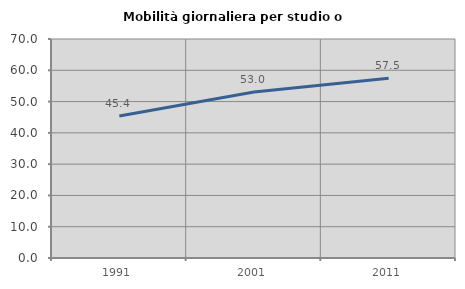
| Category | Mobilità giornaliera per studio o lavoro |
|---|---|
| 1991.0 | 45.387 |
| 2001.0 | 53.041 |
| 2011.0 | 57.491 |